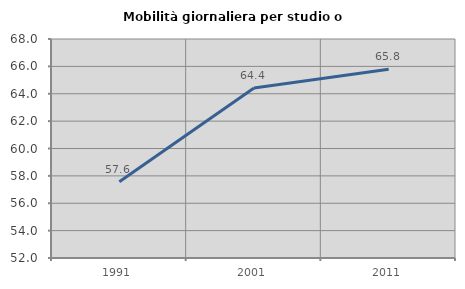
| Category | Mobilità giornaliera per studio o lavoro |
|---|---|
| 1991.0 | 57.568 |
| 2001.0 | 64.417 |
| 2011.0 | 65.789 |